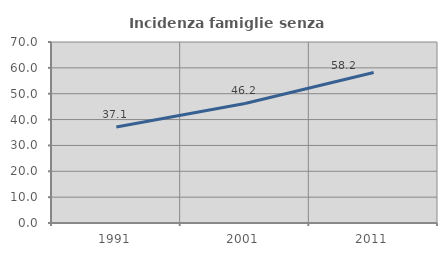
| Category | Incidenza famiglie senza nuclei |
|---|---|
| 1991.0 | 37.113 |
| 2001.0 | 46.237 |
| 2011.0 | 58.228 |